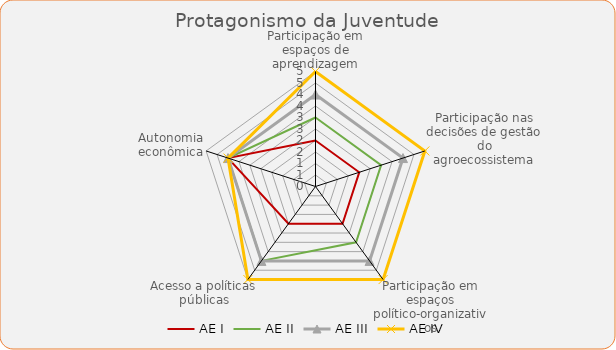
| Category | AE I | AE II | AE III | AE IV |
|---|---|---|---|---|
| Participação em espaços de aprendizagem | 2 | 3 | 4 | 5 |
| Participação nas decisões de gestão do agroecossistema | 2 | 3 | 4 | 5 |
| Participação em espaços político-organizativos | 2 | 3 | 4 | 5 |
| Acesso a políticas públicas | 2 | 4 | 4 | 5 |
| Autonomia econômica | 4 | 4 | 4 | 4 |